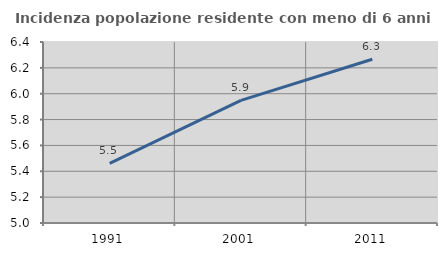
| Category | Incidenza popolazione residente con meno di 6 anni |
|---|---|
| 1991.0 | 5.462 |
| 2001.0 | 5.949 |
| 2011.0 | 6.266 |